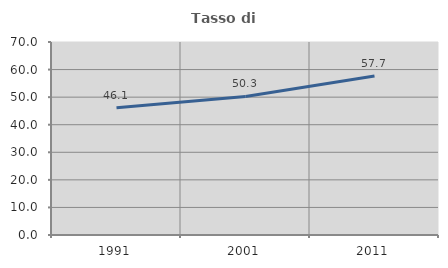
| Category | Tasso di occupazione   |
|---|---|
| 1991.0 | 46.148 |
| 2001.0 | 50.256 |
| 2011.0 | 57.692 |